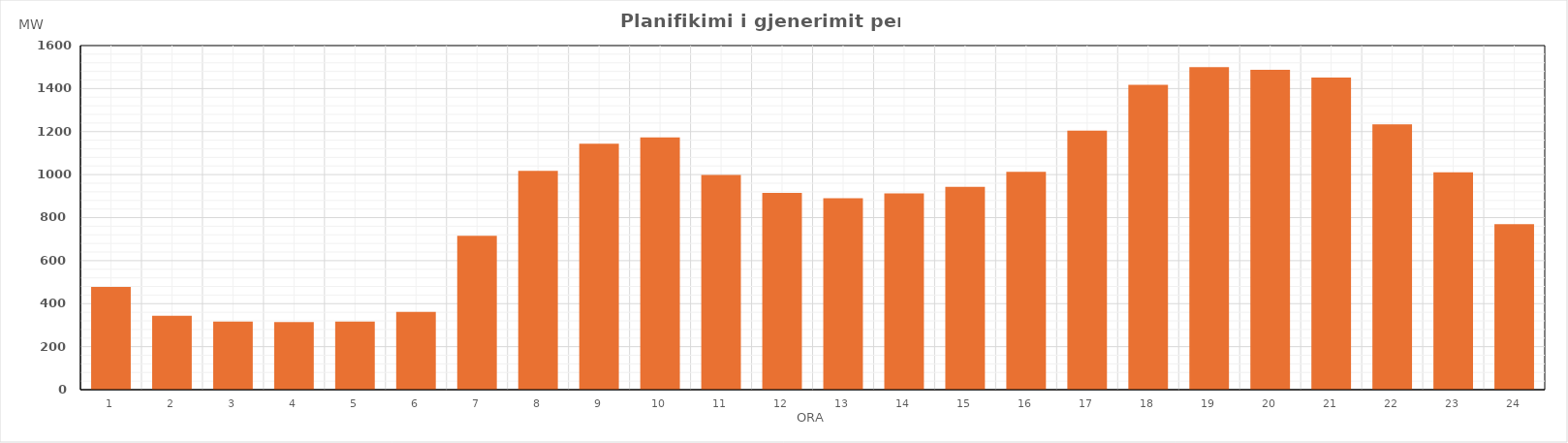
| Category | Max (MW) |
|---|---|
| 0 | 478.11 |
| 1 | 343.61 |
| 2 | 316.51 |
| 3 | 314.51 |
| 4 | 316.41 |
| 5 | 361.24 |
| 6 | 715.71 |
| 7 | 1017.75 |
| 8 | 1144.07 |
| 9 | 1173.07 |
| 10 | 997.79 |
| 11 | 914.81 |
| 12 | 889.9 |
| 13 | 913 |
| 14 | 942.81 |
| 15 | 1013.26 |
| 16 | 1204.72 |
| 17 | 1417.68 |
| 18 | 1500.13 |
| 19 | 1487.18 |
| 20 | 1450.86 |
| 21 | 1233.51 |
| 22 | 1011.23 |
| 23 | 769.41 |